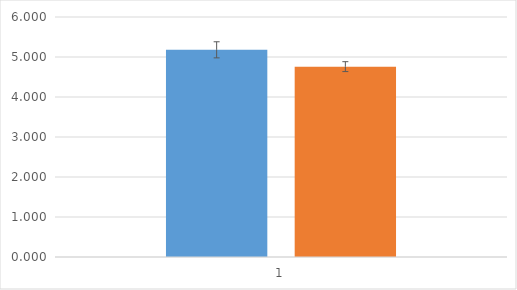
| Category | control | PKD3tg |
|---|---|---|
| 0 | 5.18 | 4.759 |